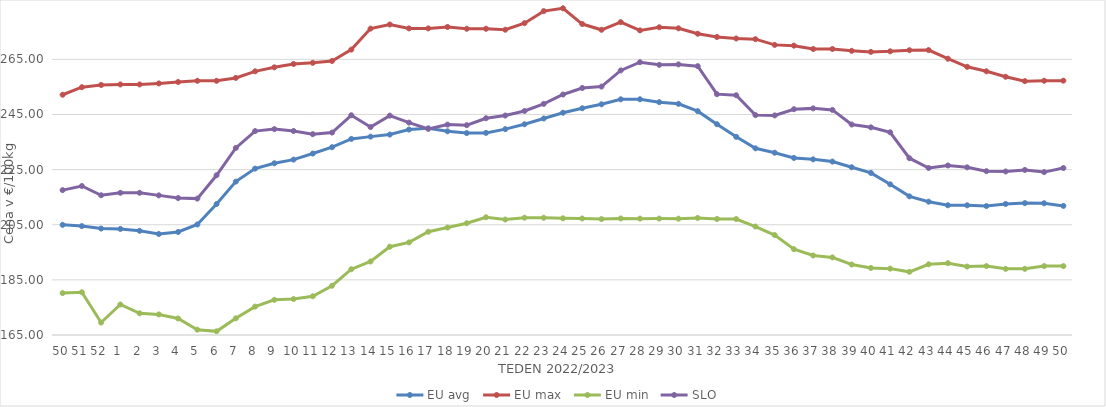
| Category | EU avg | EU max | EU min | SLO |
|---|---|---|---|---|
| 50.0 | 204.962 | 252.163 | 180.2 | 217.56 |
| 51.0 | 204.512 | 254.908 | 180.51 | 219.05 |
| 52.0 | 203.626 | 255.711 | 169.52 | 215.7 |
| 1.0 | 203.488 | 255.906 | 176.07 | 216.59 |
| 2.0 | 202.798 | 255.906 | 172.86 | 216.6 |
| 3.0 | 201.648 | 256.274 | 172.47 | 215.66 |
| 4.0 | 202.375 | 256.795 | 171 | 214.69 |
| 5.0 | 205.107 | 257.225 | 166.928 | 214.48 |
| 6.0 | 212.52 | 257.225 | 166.328 | 222.96 |
| 7.0 | 220.644 | 258.268 | 171.047 | 232.85 |
| 8.0 | 225.367 | 260.661 | 175.287 | 238.98 |
| 9.0 | 227.304 | 262.113 | 177.762 | 239.7 |
| 10.0 | 228.631 | 263.33 | 178.042 | 239.01 |
| 11.0 | 230.83 | 263.739 | 179.05 | 237.87 |
| 12.0 | 233.134 | 264.424 | 182.869 | 238.45 |
| 13.0 | 236.145 | 268.535 | 188.865 | 244.72 |
| 14.0 | 236.968 | 276.163 | 191.667 | 240.44 |
| 15.0 | 237.725 | 277.656 | 197.024 | 244.6 |
| 16.0 | 239.539 | 276.235 | 198.606 | 242.05 |
| 17.0 | 239.988 | 276.235 | 202.459 | 239.79 |
| 18.0 | 238.901 | 276.756 | 203.976 | 241.33 |
| 19.0 | 238.261 | 276.102 | 205.561 | 241.12 |
| 20.0 | 238.329 | 276.102 | 207.716 | 243.64 |
| 21.0 | 239.699 | 275.754 | 206.889 | 244.62 |
| 22.0 | 241.454 | 278.141 | 207.557 | 246.28 |
| 23.0 | 243.548 | 282.509 | 207.53 | 248.85 |
| 24.0 | 245.647 | 283.534 | 207.338 | 252.25 |
| 25.0 | 247.261 | 277.819 | 207.276 | 254.62 |
| 26.0 | 248.702 | 275.73 | 207.055 | 255.13 |
| 27.0 | 250.509 | 278.52 | 207.278 | 260.99 |
| 28.0 | 250.524 | 275.52 | 207.22 | 263.97 |
| 29.0 | 249.479 | 276.64 | 207.237 | 263.01 |
| 30.0 | 248.867 | 276.26 | 207.198 | 263.18 |
| 31.0 | 246.217 | 274.3 | 207.462 | 262.54 |
| 32.0 | 241.48 | 273.126 | 207.08 | 252.38 |
| 33.0 | 236.89 | 272.574 | 207.07 | 251.98 |
| 34.0 | 232.726 | 272.328 | 204.344 | 244.78 |
| 35.0 | 231.138 | 270.258 | 201.263 | 244.66 |
| 36.0 | 229.24 | 269.976 | 196.14 | 246.92 |
| 37.0 | 228.726 | 268.76 | 193.84 | 247.22 |
| 38.0 | 227.918 | 268.76 | 193.154 | 246.66 |
| 39.0 | 225.862 | 268.105 | 190.567 | 241.36 |
| 40.0 | 223.804 | 267.716 | 189.328 | 240.34 |
| 41.0 | 219.665 | 267.921 | 189.079 | 238.54 |
| 42.0 | 215.304 | 268.33 | 187.914 | 229.14 |
| 43.0 | 213.37 | 268.371 | 190.659 | 225.6 |
| 44.0 | 212.072 | 265.237 | 191.06 | 226.51 |
| 45.0 | 212.056 | 262.297 | 189.82 | 225.83 |
| 46.0 | 211.777 | 260.671 | 190 | 224.44 |
| 47.0 | 212.538 | 258.697 | 189 | 224.32 |
| 48.0 | 212.849 | 257.102 | 189 | 224.88 |
| 49.0 | 212.798 | 257.245 | 190 | 224.1 |
| 50.0 | 211.839 | 257.276 | 190 | 225.58 |